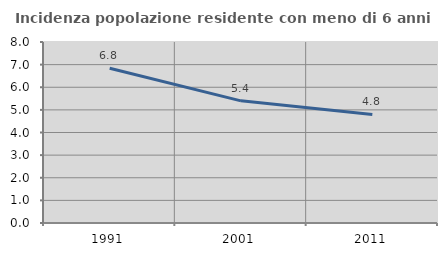
| Category | Incidenza popolazione residente con meno di 6 anni |
|---|---|
| 1991.0 | 6.843 |
| 2001.0 | 5.399 |
| 2011.0 | 4.797 |